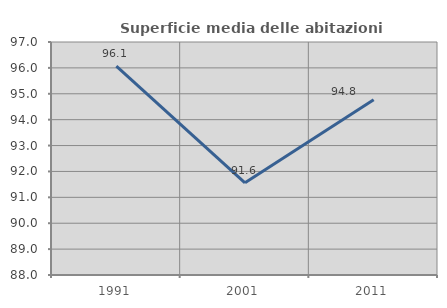
| Category | Superficie media delle abitazioni occupate |
|---|---|
| 1991.0 | 96.065 |
| 2001.0 | 91.561 |
| 2011.0 | 94.766 |